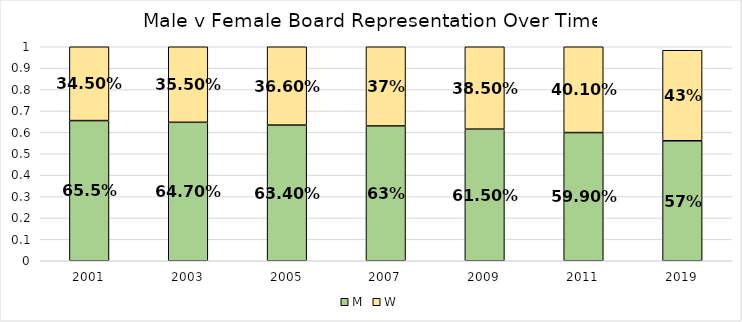
| Category | M | W |
|---|---|---|
| 2001 | 0.655 | 0.345 |
| 2003 | 0.647 | 0.355 |
| 2005 | 0.634 | 0.366 |
| 2007 | 0.63 | 0.37 |
| 2009 | 0.615 | 0.385 |
| 2011 | 0.599 | 0.401 |
| 2019 | 0.561 | 0.423 |